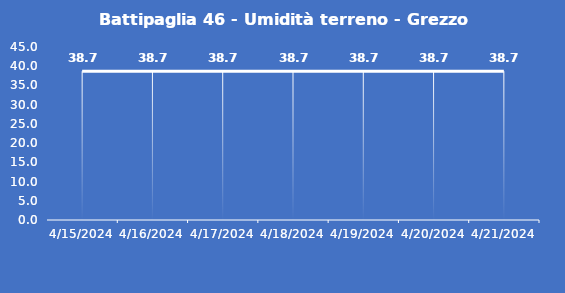
| Category | Battipaglia 46 - Umidità terreno - Grezzo (%VWC) |
|---|---|
| 4/15/24 | 38.7 |
| 4/16/24 | 38.7 |
| 4/17/24 | 38.7 |
| 4/18/24 | 38.7 |
| 4/19/24 | 38.7 |
| 4/20/24 | 38.7 |
| 4/21/24 | 38.7 |